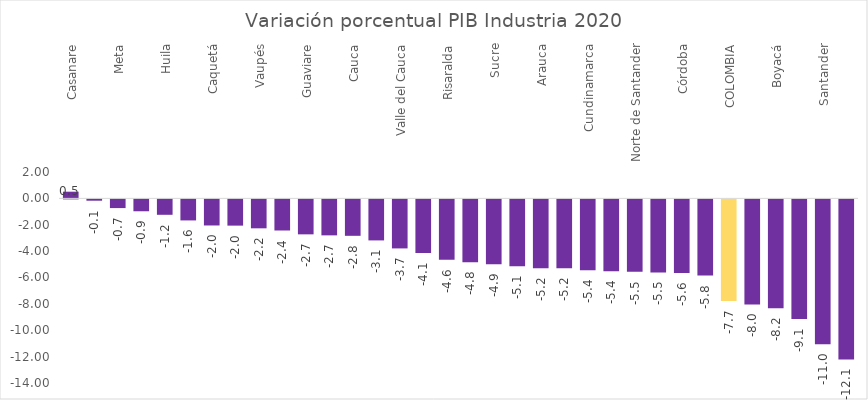
| Category | Variación porcentual PIB Industria 2020 |
|---|---|
| Casanare | 0.506 |
| Cesar | -0.101 |
| Meta | -0.66 |
| Magdalena | -0.902 |
| Huila | -1.169 |
| La Guajira | -1.596 |
| Caquetá | -1.979 |
| Vichada | -1.991 |
| Vaupés | -2.194 |
| Guainía | -2.36 |
| Guaviare | -2.652 |
| Putumayo | -2.728 |
| Cauca | -2.764 |
| Caldas | -3.112 |
| Valle del Cauca | -3.718 |
| San Andrés, Providencia y Santa Catalina (Archipiélago) | -4.061 |
| Risaralda | -4.571 |
| Quindío | -4.761 |
| Sucre | -4.917 |
| Chocó | -5.073 |
| Arauca | -5.218 |
| Nariño | -5.219 |
| Cundinamarca | -5.372 |
| Amazonas | -5.449 |
| Norte de Santander | -5.485 |
| Atlántico | -5.545 |
| Córdoba | -5.58 |
| Tolima | -5.779 |
| COLOMBIA | -7.697 |
| Bolívar | -7.966 |
| Boyacá | -8.25 |
| Antioquia | -9.068 |
| Santander | -10.98 |
| Bogotá D.C. | -12.137 |